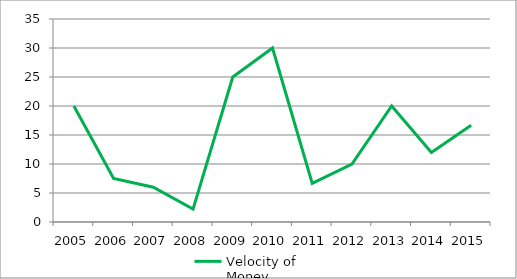
| Category | Velocity of Money |
|---|---|
| 2005.0 | 20 |
| 2006.0 | 7.5 |
| 2007.0 | 6 |
| 2008.0 | 2.222 |
| 2009.0 | 25 |
| 2010.0 | 30 |
| 2011.0 | 6.667 |
| 2012.0 | 10 |
| 2013.0 | 20 |
| 2014.0 | 12 |
| 2015.0 | 16.667 |